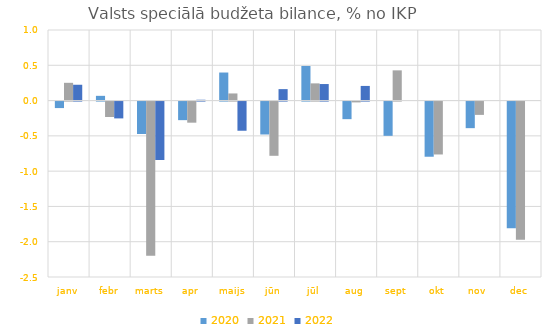
| Category | 2020 | 2021 | 2022 |
|---|---|---|---|
| janv | -0.092 | 0.252 | 0.224 |
| febr | 0.067 | -0.219 | -0.238 |
| marts | -0.46 | -2.186 | -0.828 |
| apr | -0.263 | -0.299 | 0.012 |
| maijs | 0.397 | 0.101 | -0.413 |
| jūn | -0.466 | -0.768 | 0.162 |
| jūl | 0.49 | 0.244 | 0.234 |
| aug | -0.249 | -0.012 | 0.207 |
| sept | -0.485 | 0.428 | 0 |
| okt | -0.782 | -0.75 | 0 |
| nov | -0.377 | -0.189 | 0 |
| dec | -1.793 | -1.958 | 0 |